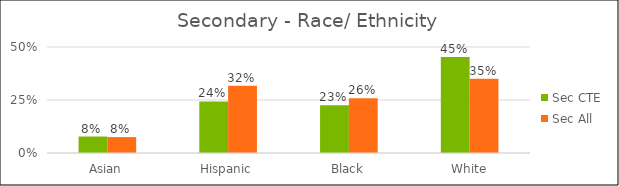
| Category | Sec CTE | Sec All |
|---|---|---|
| Asian | 0.078 | 0.075 |
| Hispanic | 0.243 | 0.317 |
| Black | 0.225 | 0.258 |
| White | 0.453 | 0.35 |